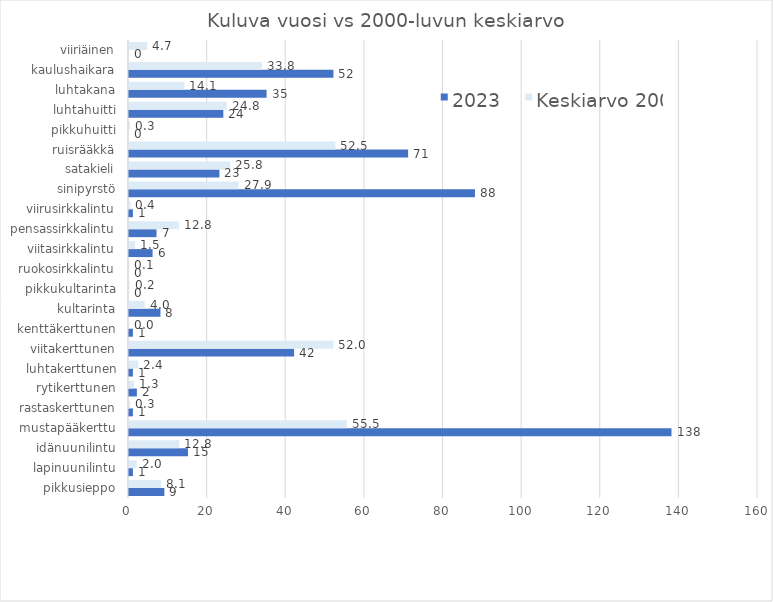
| Category | 2023 | Keskiarvo 2000–2023 |
|---|---|---|
| pikkusieppo | 9 | 8.125 |
| lapinuunilintu | 1 | 1.958 |
| idänuunilintu | 15 | 12.792 |
| mustapääkerttu | 138 | 55.458 |
| rastaskerttunen | 1 | 0.25 |
| rytikerttunen | 2 | 1.25 |
| luhtakerttunen | 1 | 2.375 |
| viitakerttunen | 42 | 51.958 |
| kenttäkerttunen | 1 | 0.042 |
| kultarinta | 8 | 4 |
| pikkukultarinta | 0 | 0.167 |
| ruokosirkkalintu | 0 | 0.125 |
| viitasirkkalintu | 6 | 1.542 |
| pensassirkkalintu | 7 | 12.75 |
| viirusirkkalintu | 1 | 0.375 |
| sinipyrstö | 88 | 27.917 |
| satakieli | 23 | 25.75 |
| ruisrääkkä | 71 | 52.5 |
| pikkuhuitti | 0 | 0.25 |
| luhtahuitti | 24 | 24.833 |
| luhtakana | 35 | 14.083 |
| kaulushaikara | 52 | 33.833 |
| viiriäinen | 0 | 4.667 |